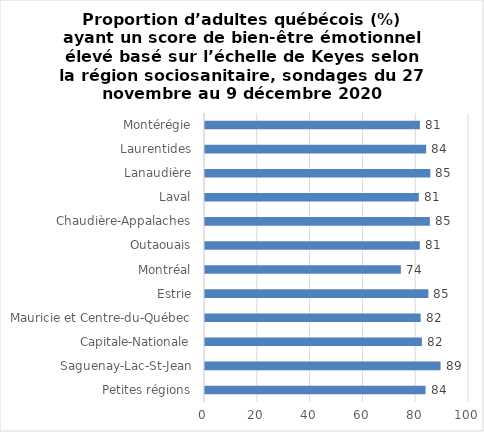
| Category | % |
|---|---|
| Petites régions | 83.546 |
| Saguenay-Lac-St-Jean | 89.232 |
| Capitale-Nationale | 82.169 |
| Mauricie et Centre-du-Québec | 81.682 |
| Estrie | 84.609 |
| Montréal | 74.197 |
| Outaouais | 81.354 |
| Chaudière-Appalaches | 85.176 |
| Laval | 81 |
| Lanaudière | 85.356 |
| Laurentides | 83.762 |
| Montérégie | 81.382 |